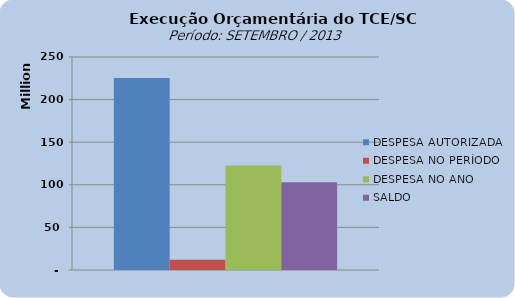
| Category | DESPESA AUTORIZADA | DESPESA NO PERÍODO | DESPESA NO ANO | SALDO |
|---|---|---|---|---|
| 0 | 225494617.73 | 11884921.06 | 122518736.16 | 102975881.57 |